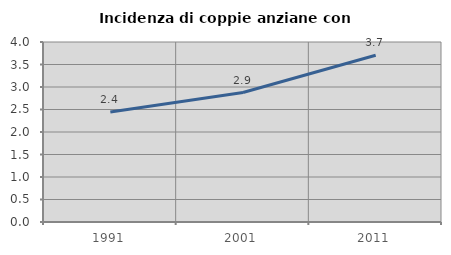
| Category | Incidenza di coppie anziane con figli |
|---|---|
| 1991.0 | 2.444 |
| 2001.0 | 2.877 |
| 2011.0 | 3.706 |